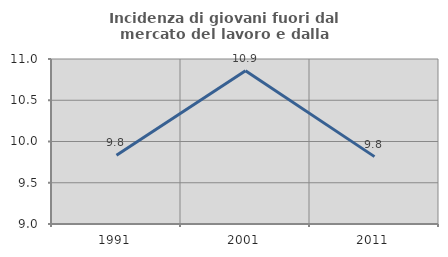
| Category | Incidenza di giovani fuori dal mercato del lavoro e dalla formazione  |
|---|---|
| 1991.0 | 9.834 |
| 2001.0 | 10.857 |
| 2011.0 | 9.817 |